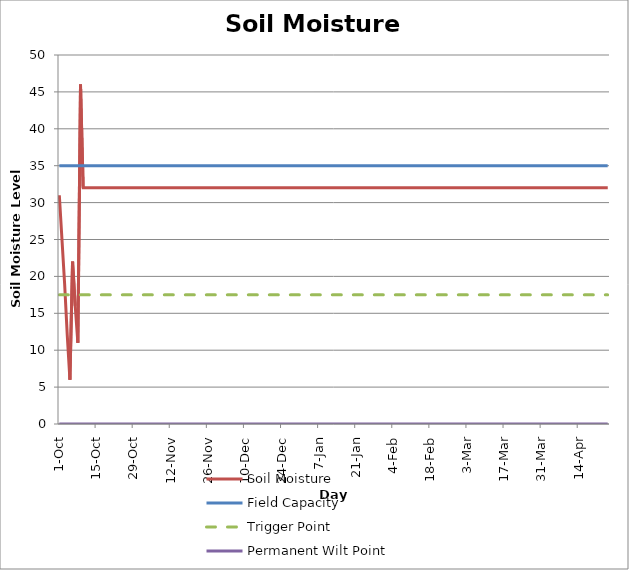
| Category | Soil Moisture | Field Capacity | Trigger Point | Permanent Wilt Point |
|---|---|---|---|---|
| 2015-10-01 | 31 | 35 | 17.5 | 0 |
| 2015-10-02 | 25 | 35 | 17.5 | 0 |
| 2015-10-03 | 19 | 35 | 17.5 | 0 |
| 2015-10-04 | 12 | 35 | 17.5 | 0 |
| 2015-10-05 | 6 | 35 | 17.5 | 0 |
| 2015-10-06 | 22 | 35 | 17.5 | 0 |
| 2015-10-07 | 16 | 35 | 17.5 | 0 |
| 2015-10-08 | 11 | 35 | 17.5 | 0 |
| 2015-10-09 | 46 | 35 | 17.5 | 0 |
| 2015-10-10 | 32 | 35 | 17.5 | 0 |
| 2015-10-11 | 32 | 35 | 17.5 | 0 |
| 2015-10-12 | 32 | 35 | 17.5 | 0 |
| 2015-10-13 | 32 | 35 | 17.5 | 0 |
| 2015-10-14 | 32 | 35 | 17.5 | 0 |
| 2015-10-15 | 32 | 35 | 17.5 | 0 |
| 2015-10-16 | 32 | 35 | 17.5 | 0 |
| 2015-10-17 | 32 | 35 | 17.5 | 0 |
| 2015-10-18 | 32 | 35 | 17.5 | 0 |
| 2015-10-19 | 32 | 35 | 17.5 | 0 |
| 2015-10-20 | 32 | 35 | 17.5 | 0 |
| 2015-10-21 | 32 | 35 | 17.5 | 0 |
| 2015-10-22 | 32 | 35 | 17.5 | 0 |
| 2015-10-23 | 32 | 35 | 17.5 | 0 |
| 2015-10-24 | 32 | 35 | 17.5 | 0 |
| 2015-10-25 | 32 | 35 | 17.5 | 0 |
| 2015-10-26 | 32 | 35 | 17.5 | 0 |
| 2015-10-27 | 32 | 35 | 17.5 | 0 |
| 2015-10-28 | 32 | 35 | 17.5 | 0 |
| 2015-10-29 | 32 | 35 | 17.5 | 0 |
| 2015-10-30 | 32 | 35 | 17.5 | 0 |
| 2015-10-31 | 32 | 35 | 17.5 | 0 |
| 2015-11-01 | 32 | 35 | 17.5 | 0 |
| 2015-11-02 | 32 | 35 | 17.5 | 0 |
| 2015-11-03 | 32 | 35 | 17.5 | 0 |
| 2015-11-04 | 32 | 35 | 17.5 | 0 |
| 2015-11-05 | 32 | 35 | 17.5 | 0 |
| 2015-11-06 | 32 | 35 | 17.5 | 0 |
| 2015-11-07 | 32 | 35 | 17.5 | 0 |
| 2015-11-08 | 32 | 35 | 17.5 | 0 |
| 2015-11-09 | 32 | 35 | 17.5 | 0 |
| 2015-11-10 | 32 | 35 | 17.5 | 0 |
| 2015-11-11 | 32 | 35 | 17.5 | 0 |
| 2015-11-12 | 32 | 35 | 17.5 | 0 |
| 2015-11-13 | 32 | 35 | 17.5 | 0 |
| 2015-11-14 | 32 | 35 | 17.5 | 0 |
| 2015-11-15 | 32 | 35 | 17.5 | 0 |
| 2015-11-16 | 32 | 35 | 17.5 | 0 |
| 2015-11-17 | 32 | 35 | 17.5 | 0 |
| 2015-11-18 | 32 | 35 | 17.5 | 0 |
| 2015-11-19 | 32 | 35 | 17.5 | 0 |
| 2015-11-20 | 32 | 35 | 17.5 | 0 |
| 2015-11-21 | 32 | 35 | 17.5 | 0 |
| 2015-11-22 | 32 | 35 | 17.5 | 0 |
| 2015-11-23 | 32 | 35 | 17.5 | 0 |
| 2015-11-24 | 32 | 35 | 17.5 | 0 |
| 2015-11-25 | 32 | 35 | 17.5 | 0 |
| 2015-11-26 | 32 | 35 | 17.5 | 0 |
| 2015-11-27 | 32 | 35 | 17.5 | 0 |
| 2015-11-28 | 32 | 35 | 17.5 | 0 |
| 2015-11-29 | 32 | 35 | 17.5 | 0 |
| 2015-11-30 | 32 | 35 | 17.5 | 0 |
| 2015-12-01 | 32 | 35 | 17.5 | 0 |
| 2015-12-02 | 32 | 35 | 17.5 | 0 |
| 2015-12-03 | 32 | 35 | 17.5 | 0 |
| 2015-12-04 | 32 | 35 | 17.5 | 0 |
| 2015-12-05 | 32 | 35 | 17.5 | 0 |
| 2015-12-06 | 32 | 35 | 17.5 | 0 |
| 2015-12-07 | 32 | 35 | 17.5 | 0 |
| 2015-12-08 | 32 | 35 | 17.5 | 0 |
| 2015-12-09 | 32 | 35 | 17.5 | 0 |
| 2015-12-10 | 32 | 35 | 17.5 | 0 |
| 2015-12-11 | 32 | 35 | 17.5 | 0 |
| 2015-12-12 | 32 | 35 | 17.5 | 0 |
| 2015-12-13 | 32 | 35 | 17.5 | 0 |
| 2015-12-14 | 32 | 35 | 17.5 | 0 |
| 2015-12-15 | 32 | 35 | 17.5 | 0 |
| 2015-12-16 | 32 | 35 | 17.5 | 0 |
| 2015-12-17 | 32 | 35 | 17.5 | 0 |
| 2015-12-18 | 32 | 35 | 17.5 | 0 |
| 2015-12-19 | 32 | 35 | 17.5 | 0 |
| 2015-12-20 | 32 | 35 | 17.5 | 0 |
| 2015-12-21 | 32 | 35 | 17.5 | 0 |
| 2015-12-22 | 32 | 35 | 17.5 | 0 |
| 2015-12-23 | 32 | 35 | 17.5 | 0 |
| 2015-12-24 | 32 | 35 | 17.5 | 0 |
| 2015-12-25 | 32 | 35 | 17.5 | 0 |
| 2015-12-26 | 32 | 35 | 17.5 | 0 |
| 2015-12-27 | 32 | 35 | 17.5 | 0 |
| 2015-12-28 | 32 | 35 | 17.5 | 0 |
| 2015-12-29 | 32 | 35 | 17.5 | 0 |
| 2015-12-30 | 32 | 35 | 17.5 | 0 |
| 2015-12-31 | 32 | 35 | 17.5 | 0 |
| 2016-01-01 | 32 | 35 | 17.5 | 0 |
| 2016-01-02 | 32 | 35 | 17.5 | 0 |
| 2016-01-03 | 32 | 35 | 17.5 | 0 |
| 2016-01-04 | 32 | 35 | 17.5 | 0 |
| 2016-01-05 | 32 | 35 | 17.5 | 0 |
| 2016-01-06 | 32 | 35 | 17.5 | 0 |
| 2016-01-07 | 32 | 35 | 17.5 | 0 |
| 2016-01-08 | 32 | 35 | 17.5 | 0 |
| 2016-01-09 | 32 | 35 | 17.5 | 0 |
| 2016-01-10 | 32 | 35 | 17.5 | 0 |
| 2016-01-11 | 32 | 35 | 17.5 | 0 |
| 2016-01-12 | 32 | 35 | 17.5 | 0 |
| 2016-01-13 | 32 | 35 | 17.5 | 0 |
| 2016-01-14 | 32 | 35 | 17.5 | 0 |
| 2016-01-15 | 32 | 35 | 17.5 | 0 |
| 2016-01-16 | 32 | 35 | 17.5 | 0 |
| 2016-01-17 | 32 | 35 | 17.5 | 0 |
| 2016-01-18 | 32 | 35 | 17.5 | 0 |
| 2016-01-19 | 32 | 35 | 17.5 | 0 |
| 2016-01-20 | 32 | 35 | 17.5 | 0 |
| 2016-01-21 | 32 | 35 | 17.5 | 0 |
| 2016-01-22 | 32 | 35 | 17.5 | 0 |
| 2016-01-23 | 32 | 35 | 17.5 | 0 |
| 2016-01-24 | 32 | 35 | 17.5 | 0 |
| 2016-01-25 | 32 | 35 | 17.5 | 0 |
| 2016-01-26 | 32 | 35 | 17.5 | 0 |
| 2016-01-27 | 32 | 35 | 17.5 | 0 |
| 2016-01-28 | 32 | 35 | 17.5 | 0 |
| 2016-01-29 | 32 | 35 | 17.5 | 0 |
| 2016-01-30 | 32 | 35 | 17.5 | 0 |
| 2016-01-31 | 32 | 35 | 17.5 | 0 |
| 2016-02-01 | 32 | 35 | 17.5 | 0 |
| 2016-02-02 | 32 | 35 | 17.5 | 0 |
| 2016-02-03 | 32 | 35 | 17.5 | 0 |
| 2016-02-04 | 32 | 35 | 17.5 | 0 |
| 2016-02-05 | 32 | 35 | 17.5 | 0 |
| 2016-02-06 | 32 | 35 | 17.5 | 0 |
| 2016-02-07 | 32 | 35 | 17.5 | 0 |
| 2016-02-08 | 32 | 35 | 17.5 | 0 |
| 2016-02-09 | 32 | 35 | 17.5 | 0 |
| 2016-02-10 | 32 | 35 | 17.5 | 0 |
| 2016-02-11 | 32 | 35 | 17.5 | 0 |
| 2016-02-12 | 32 | 35 | 17.5 | 0 |
| 2016-02-13 | 32 | 35 | 17.5 | 0 |
| 2016-02-14 | 32 | 35 | 17.5 | 0 |
| 2016-02-15 | 32 | 35 | 17.5 | 0 |
| 2016-02-16 | 32 | 35 | 17.5 | 0 |
| 2016-02-17 | 32 | 35 | 17.5 | 0 |
| 2016-02-18 | 32 | 35 | 17.5 | 0 |
| 2016-02-19 | 32 | 35 | 17.5 | 0 |
| 2016-02-20 | 32 | 35 | 17.5 | 0 |
| 2016-02-21 | 32 | 35 | 17.5 | 0 |
| 2016-02-22 | 32 | 35 | 17.5 | 0 |
| 2016-02-23 | 32 | 35 | 17.5 | 0 |
| 2016-02-24 | 32 | 35 | 17.5 | 0 |
| 2016-02-25 | 32 | 35 | 17.5 | 0 |
| 2016-02-26 | 32 | 35 | 17.5 | 0 |
| 2016-02-27 | 32 | 35 | 17.5 | 0 |
| 2016-02-28 | 32 | 35 | 17.5 | 0 |
| 2016-02-29 | 32 | 35 | 17.5 | 0 |
| 2016-03-01 | 32 | 35 | 17.5 | 0 |
| 2016-03-02 | 32 | 35 | 17.5 | 0 |
| 2016-03-03 | 32 | 35 | 17.5 | 0 |
| 2016-03-04 | 32 | 35 | 17.5 | 0 |
| 2016-03-05 | 32 | 35 | 17.5 | 0 |
| 2016-03-06 | 32 | 35 | 17.5 | 0 |
| 2016-03-07 | 32 | 35 | 17.5 | 0 |
| 2016-03-08 | 32 | 35 | 17.5 | 0 |
| 2016-03-09 | 32 | 35 | 17.5 | 0 |
| 2016-03-10 | 32 | 35 | 17.5 | 0 |
| 2016-03-11 | 32 | 35 | 17.5 | 0 |
| 2016-03-12 | 32 | 35 | 17.5 | 0 |
| 2016-03-13 | 32 | 35 | 17.5 | 0 |
| 2016-03-14 | 32 | 35 | 17.5 | 0 |
| 2016-03-15 | 32 | 35 | 17.5 | 0 |
| 2016-03-16 | 32 | 35 | 17.5 | 0 |
| 2016-03-17 | 32 | 35 | 17.5 | 0 |
| 2016-03-18 | 32 | 35 | 17.5 | 0 |
| 2016-03-19 | 32 | 35 | 17.5 | 0 |
| 2016-03-20 | 32 | 35 | 17.5 | 0 |
| 2016-03-21 | 32 | 35 | 17.5 | 0 |
| 2016-03-22 | 32 | 35 | 17.5 | 0 |
| 2016-03-23 | 32 | 35 | 17.5 | 0 |
| 2016-03-24 | 32 | 35 | 17.5 | 0 |
| 2016-03-25 | 32 | 35 | 17.5 | 0 |
| 2016-03-26 | 32 | 35 | 17.5 | 0 |
| 2016-03-27 | 32 | 35 | 17.5 | 0 |
| 2016-03-28 | 32 | 35 | 17.5 | 0 |
| 2016-03-29 | 32 | 35 | 17.5 | 0 |
| 2016-03-30 | 32 | 35 | 17.5 | 0 |
| 2016-03-31 | 32 | 35 | 17.5 | 0 |
| 2016-04-01 | 32 | 35 | 17.5 | 0 |
| 2016-04-02 | 32 | 35 | 17.5 | 0 |
| 2016-04-03 | 32 | 35 | 17.5 | 0 |
| 2016-04-04 | 32 | 35 | 17.5 | 0 |
| 2016-04-05 | 32 | 35 | 17.5 | 0 |
| 2016-04-06 | 32 | 35 | 17.5 | 0 |
| 2016-04-07 | 32 | 35 | 17.5 | 0 |
| 2016-04-08 | 32 | 35 | 17.5 | 0 |
| 2016-04-09 | 32 | 35 | 17.5 | 0 |
| 2016-04-10 | 32 | 35 | 17.5 | 0 |
| 2016-04-11 | 32 | 35 | 17.5 | 0 |
| 2016-04-12 | 32 | 35 | 17.5 | 0 |
| 2016-04-13 | 32 | 35 | 17.5 | 0 |
| 2016-04-14 | 32 | 35 | 17.5 | 0 |
| 2016-04-15 | 32 | 35 | 17.5 | 0 |
| 2016-04-16 | 32 | 35 | 17.5 | 0 |
| 2016-04-17 | 32 | 35 | 17.5 | 0 |
| 2016-04-18 | 32 | 35 | 17.5 | 0 |
| 2016-04-19 | 32 | 35 | 17.5 | 0 |
| 2016-04-20 | 32 | 35 | 17.5 | 0 |
| 2016-04-21 | 32 | 35 | 17.5 | 0 |
| 2016-04-22 | 32 | 35 | 17.5 | 0 |
| 2016-04-23 | 32 | 35 | 17.5 | 0 |
| 2016-04-24 | 32 | 35 | 17.5 | 0 |
| 2016-04-25 | 32 | 35 | 17.5 | 0 |